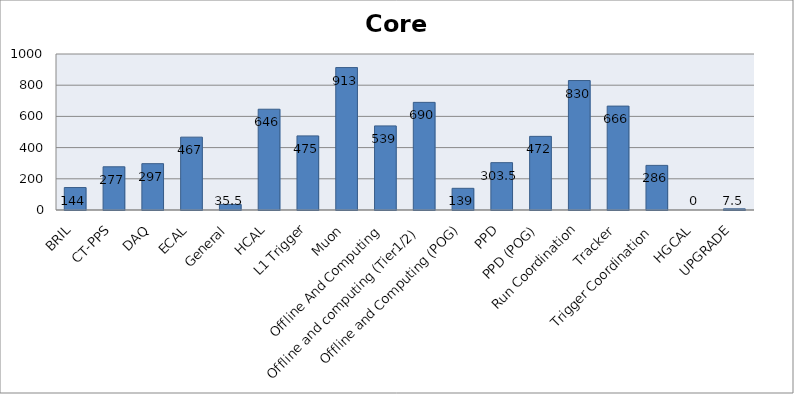
| Category | Series 0 |
|---|---|
| BRIL | 144 |
| CT-PPS | 277 |
| DAQ | 297 |
| ECAL | 467 |
| General | 35.5 |
| HCAL | 646 |
| L1 Trigger | 475 |
| Muon | 913 |
| Offline And Computing | 539 |
| Offline and computing (Tier1/2) | 690 |
| Offline and Computing (POG) | 139 |
| PPD | 303.5 |
| PPD (POG) | 472 |
| Run Coordination | 830 |
| Tracker | 666 |
| Trigger Coordination | 286 |
| HGCAL | 0 |
| UPGRADE | 7.5 |